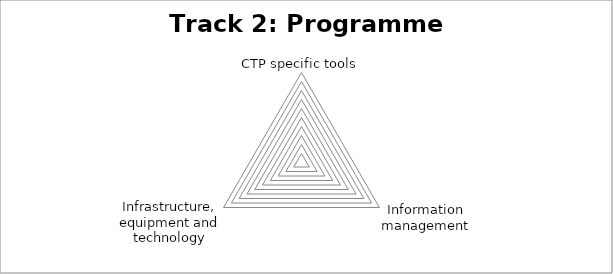
| Category | Series 0 |
|---|---|
| CTP specific tools | 0 |
| Information management | 0 |
| Infrastructure, equipment and technology | 0 |